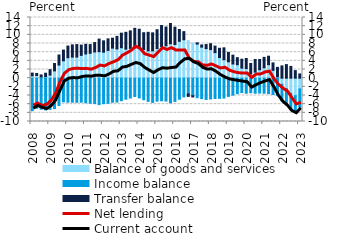
| Category | Balance of goods and services | Income balance | Transfer balance |
|---|---|---|---|
| 2008.0 | 0.541 | -7.513 | 0.629 |
| 2008.0 | 0.609 | -6.945 | 0.477 |
| 2008.0 | 0.273 | -7.172 | 0.473 |
| 2008.0 | 0.346 | -7.33 | 0.793 |
| 2009.0 | 0.706 | -7.199 | 1.252 |
| 2009.0 | 1.676 | -7.027 | 1.702 |
| 2009.0 | 3.028 | -6.31 | 2.319 |
| 2009.0 | 4.008 | -5.461 | 2.475 |
| 2010.0 | 4.718 | -5.542 | 2.696 |
| 2010.0 | 4.856 | -5.548 | 2.822 |
| 2010.0 | 4.875 | -5.569 | 2.881 |
| 2010.0 | 5.259 | -5.545 | 2.37 |
| 2011.0 | 5.584 | -5.666 | 2.229 |
| 2011.0 | 5.738 | -5.787 | 2.01 |
| 2011.0 | 6.051 | -5.869 | 2.165 |
| 2011.0 | 6.114 | -6.109 | 2.905 |
| 2012.0 | 5.99 | -5.885 | 2.621 |
| 2012.0 | 6.405 | -5.809 | 2.664 |
| 2012.0 | 6.932 | -5.562 | 2.291 |
| 2012.0 | 6.749 | -5.515 | 2.895 |
| 2013.0 | 7.032 | -5.201 | 3.352 |
| 2013.0 | 6.701 | -4.855 | 3.878 |
| 2013.0 | 6.881 | -4.589 | 4.034 |
| 2013.0 | 6.971 | -4.23 | 4.522 |
| 2014.0 | 7.036 | -4.566 | 4.26 |
| 2014.0 | 6.623 | -4.977 | 3.871 |
| 2014.0 | 6.307 | -5.364 | 4.275 |
| 2014.0 | 6.316 | -5.599 | 4.145 |
| 2015.0 | 6.838 | -5.309 | 4.35 |
| 2015.0 | 7.308 | -5.216 | 4.842 |
| 2015.0 | 7.477 | -5.283 | 4.32 |
| 2015.0 | 7.943 | -5.693 | 4.673 |
| 2016.0 | 7.764 | -5.377 | 4.002 |
| 2016.0 | 8.503 | -4.87 | 2.723 |
| 2016.0 | 8.868 | -4.329 | 1.866 |
| 2016.0 | 8.672 | -3.641 | -0.569 |
| 2017.0 | 8.089 | -4.054 | -0.284 |
| 2017.0 | 7.862 | -4.508 | 0.303 |
| 2017.0 | 7.163 | -4.725 | 0.502 |
| 2017.0 | 6.82 | -4.916 | 0.941 |
| 2018.0 | 6.595 | -4.794 | 1.358 |
| 2018.0 | 5.894 | -4.689 | 1.507 |
| 2018.0 | 4.759 | -4.663 | 2.139 |
| 2018.0 | 4.267 | -4.589 | 2.734 |
| 2019.0 | 3.779 | -4.209 | 2.157 |
| 2019.0 | 3.275 | -3.931 | 2.033 |
| 2019.0 | 3.104 | -3.58 | 1.627 |
| 2019.0 | 2.325 | -3.324 | 2.048 |
| 2020.0 | 2.215 | -3.479 | 2.325 |
| 2020.0 | 0.977 | -3.354 | 2.42 |
| 2020.0 | 1.408 | -3.475 | 2.895 |
| 2020.0 | 1.939 | -3.439 | 2.367 |
| 2021.0 | 2.403 | -3.475 | 2.393 |
| 2021.0 | 3.122 | -3.57 | 1.946 |
| 2021.0 | 1.801 | -3.775 | 1.72 |
| 2021.0 | 0.317 | -4.018 | 2.174 |
| 2022.0 | -1.406 | -3.842 | 2.834 |
| 2022.0 | -2.393 | -3.811 | 3.13 |
| 2022.0 | -3.477 | -3.819 | 2.712 |
| 2022.0 | -4.035 | -3.772 | 1.743 |
| 2023.0 | -2.485 | -4.158 | 0.972 |